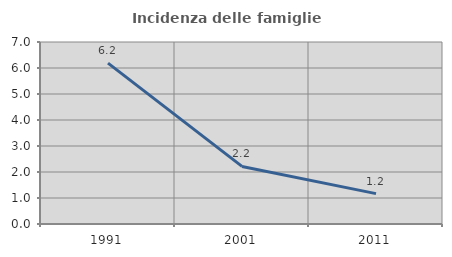
| Category | Incidenza delle famiglie numerose |
|---|---|
| 1991.0 | 6.189 |
| 2001.0 | 2.214 |
| 2011.0 | 1.167 |